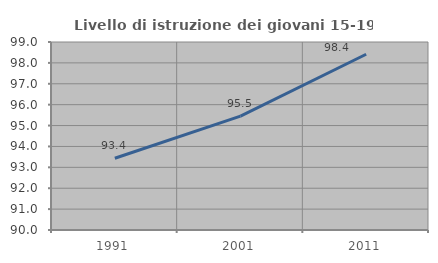
| Category | Livello di istruzione dei giovani 15-19 anni |
|---|---|
| 1991.0 | 93.436 |
| 2001.0 | 95.455 |
| 2011.0 | 98.413 |